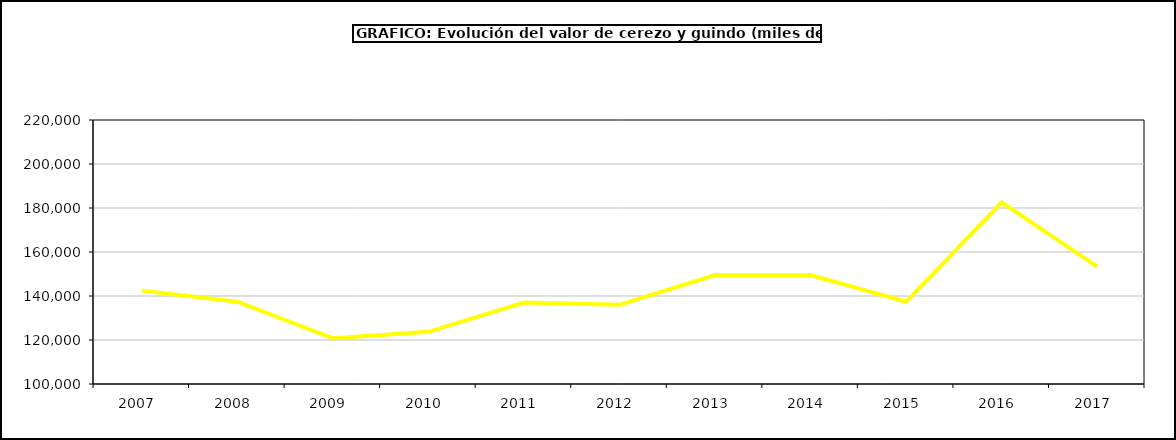
| Category | valor cerezo y guindo |
|---|---|
| 2007.0 | 142440.457 |
| 2008.0 | 137384.834 |
| 2009.0 | 120767.336 |
| 2010.0 | 123711.92 |
| 2011.0 | 137034.469 |
| 2012.0 | 136005.543 |
| 2013.0 | 149538.377 |
| 2014.0 | 149493.495 |
| 2015.0 | 137364 |
| 2016.0 | 182544 |
| 2017.0 | 153374.55 |